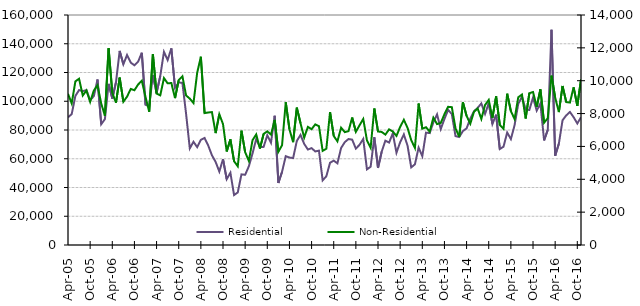
| Category | Residential |
|---|---|
| 2005-04-01 | 88840 |
| 2005-05-01 | 91030 |
| 2005-06-01 | 103700 |
| 2005-07-01 | 107770 |
| 2005-08-01 | 107040 |
| 2005-09-01 | 107710 |
| 2005-10-01 | 100650 |
| 2005-11-01 | 103570 |
| 2005-12-01 | 115150 |
| 2006-01-01 | 83980 |
| 2006-02-01 | 87550 |
| 2006-03-01 | 112090 |
| 2006-04-01 | 101830 |
| 2006-05-01 | 113160 |
| 2006-06-01 | 135030 |
| 2006-07-01 | 125720 |
| 2006-08-01 | 132180 |
| 2006-09-01 | 126890 |
| 2006-10-01 | 124980 |
| 2006-11-01 | 127530 |
| 2006-12-01 | 133770 |
| 2007-01-01 | 97580 |
| 2007-02-01 | 96560 |
| 2007-03-01 | 117970 |
| 2007-04-01 | 105780 |
| 2007-05-01 | 117560 |
| 2007-06-01 | 134370 |
| 2007-07-01 | 128660 |
| 2007-08-01 | 136790 |
| 2007-09-01 | 109250 |
| 2007-10-01 | 113080 |
| 2007-11-01 | 112770 |
| 2007-12-01 | 91140 |
| 2008-01-01 | 67220 |
| 2008-02-01 | 71820 |
| 2008-03-01 | 68100 |
| 2008-04-01 | 73130 |
| 2008-05-01 | 74470 |
| 2008-06-01 | 69150 |
| 2008-07-01 | 62400 |
| 2008-08-01 | 57810 |
| 2008-09-01 | 51080 |
| 2008-10-01 | 59710 |
| 2008-11-01 | 45780 |
| 2008-12-01 | 50260 |
| 2009-01-01 | 34750 |
| 2009-02-01 | 36580 |
| 2009-03-01 | 49130 |
| 2009-04-01 | 48840 |
| 2009-05-01 | 54720 |
| 2009-06-01 | 63710 |
| 2009-07-01 | 73760 |
| 2009-08-01 | 68080 |
| 2009-09-01 | 68260 |
| 2009-10-01 | 76320 |
| 2009-11-01 | 71150 |
| 2009-12-01 | 89920 |
| 2010-01-01 | 43110 |
| 2010-02-01 | 50920 |
| 2010-03-01 | 61810 |
| 2010-04-01 | 60830 |
| 2010-05-01 | 60500 |
| 2010-06-01 | 72370 |
| 2010-07-01 | 76590 |
| 2010-08-01 | 70320 |
| 2010-09-01 | 66440 |
| 2010-10-01 | 67380 |
| 2010-11-01 | 65080 |
| 2010-12-01 | 65650 |
| 2011-01-01 | 44970 |
| 2011-02-01 | 47830 |
| 2011-03-01 | 57200 |
| 2011-04-01 | 58700 |
| 2011-05-01 | 56820 |
| 2011-06-01 | 67500 |
| 2011-07-01 | 71550 |
| 2011-08-01 | 73720 |
| 2011-09-01 | 73310 |
| 2011-10-01 | 67030 |
| 2011-11-01 | 69730 |
| 2011-12-01 | 73780 |
| 2012-01-01 | 52630 |
| 2012-02-01 | 54440 |
| 2012-03-01 | 74960 |
| 2012-04-01 | 53590 |
| 2012-05-01 | 64960 |
| 2012-06-01 | 72590 |
| 2012-07-01 | 71240 |
| 2012-08-01 | 77690 |
| 2012-09-01 | 64200 |
| 2012-10-01 | 71490 |
| 2012-11-01 | 76910 |
| 2012-12-01 | 69100 |
| 2013-01-01 | 53990 |
| 2013-02-01 | 56120 |
| 2013-03-01 | 67740 |
| 2013-04-01 | 61780 |
| 2013-05-01 | 78170 |
| 2013-06-01 | 77850 |
| 2013-07-01 | 85310 |
| 2013-08-01 | 90850 |
| 2013-09-01 | 80640 |
| 2013-10-01 | 87730 |
| 2013-11-01 | 94020 |
| 2013-12-01 | 91030 |
| 2014-01-01 | 75750 |
| 2014-02-01 | 75100 |
| 2014-03-01 | 79280 |
| 2014-04-01 | 81140 |
| 2014-05-01 | 87930 |
| 2014-06-01 | 92950 |
| 2014-07-01 | 95430 |
| 2014-08-01 | 98450 |
| 2014-09-01 | 91170 |
| 2014-10-01 | 98630 |
| 2014-11-01 | 84150 |
| 2014-12-01 | 90650 |
| 2015-01-01 | 66750 |
| 2015-02-01 | 68390 |
| 2015-03-01 | 78240 |
| 2015-04-01 | 73690 |
| 2015-05-01 | 83310 |
| 2015-06-01 | 98200 |
| 2015-07-01 | 103160 |
| 2015-08-01 | 94260 |
| 2015-09-01 | 93940 |
| 2015-10-01 | 102540 |
| 2015-11-01 | 93490 |
| 2015-12-01 | 98400 |
| 2016-01-01 | 72750 |
| 2016-02-01 | 80110 |
| 2016-03-01 | 149710 |
| 2016-04-01 | 62130 |
| 2016-05-01 | 70450 |
| 2016-06-01 | 86770 |
| 2016-07-01 | 90150 |
| 2016-08-01 | 92540 |
| 2016-09-01 | 88900 |
| 2016-10-01 | 84540 |
| 2016-11-01 | 88860 |